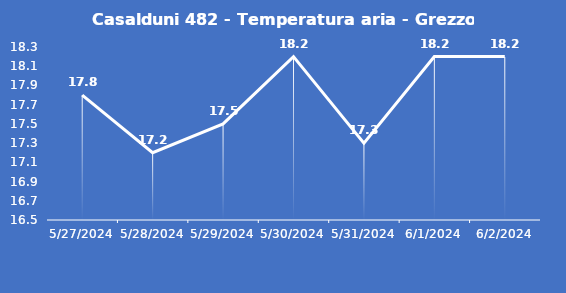
| Category | Casalduni 482 - Temperatura aria - Grezzo (°C) |
|---|---|
| 5/27/24 | 17.8 |
| 5/28/24 | 17.2 |
| 5/29/24 | 17.5 |
| 5/30/24 | 18.2 |
| 5/31/24 | 17.3 |
| 6/1/24 | 18.2 |
| 6/2/24 | 18.2 |